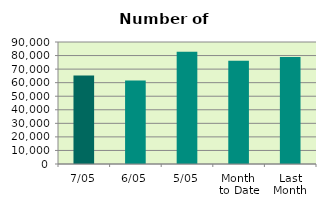
| Category | Series 0 |
|---|---|
| 7/05 | 65320 |
| 6/05 | 61572 |
| 5/05 | 82828 |
| Month 
to Date | 76237.5 |
| Last
Month | 78959.6 |